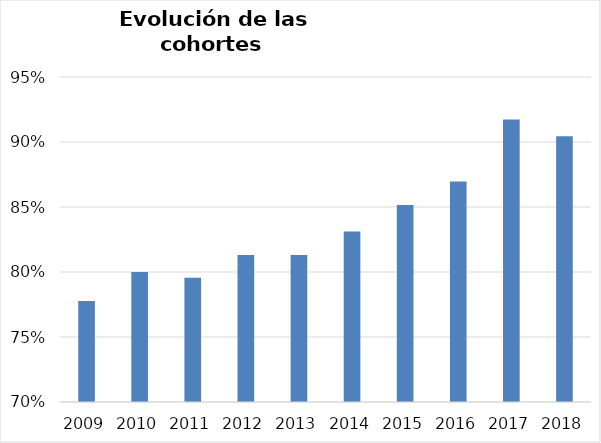
| Category | Series 0 |
|---|---|
| 2009.0 | 0.778 |
| 2010.0 | 0.8 |
| 2011.0 | 0.796 |
| 2012.0 | 0.813 |
| 2013.0 | 0.813 |
| 2014.0 | 0.831 |
| 2015.0 | 0.852 |
| 2016.0 | 0.87 |
| 2017.0 | 0.917 |
| 2018.0 | 0.904 |